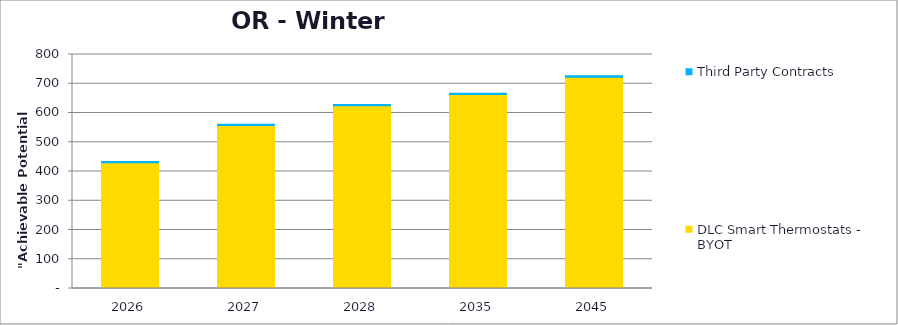
| Category | DLC Smart Thermostats - BYOT | Third Party Contracts |
|---|---|---|
| 2026.0 | 429.819 | 4.276 |
| 2027.0 | 557.369 | 4.296 |
| 2028.0 | 624.616 | 4.315 |
| 2035.0 | 663.166 | 4.455 |
| 2045.0 | 722.503 | 4.662 |